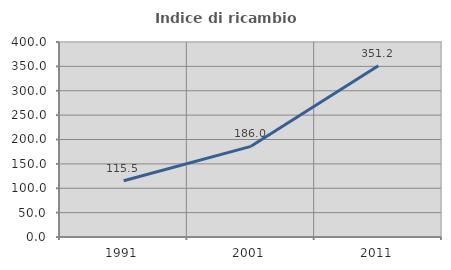
| Category | Indice di ricambio occupazionale  |
|---|---|
| 1991.0 | 115.484 |
| 2001.0 | 185.965 |
| 2011.0 | 351.19 |